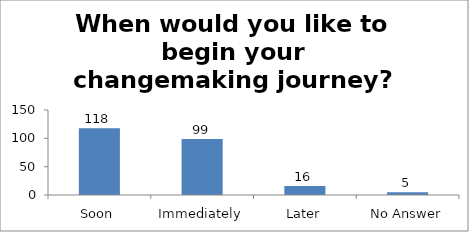
| Category | When would you like to begin your changemaking journey?  |
|---|---|
| Soon | 118 |
| Immediately | 99 |
| Later | 16 |
| No Answer | 5 |